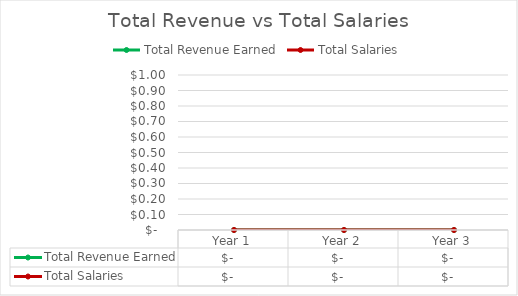
| Category | Total Revenue Earned | Total Salaries |
|---|---|---|
| Year 1 | 0 | 0 |
| Year 2 | 0 | 0 |
| Year 3 | 0 | 0 |